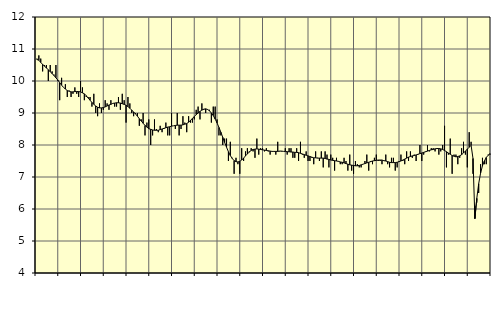
| Category | Tillverkning av verkstadsvaror, SNI 25-30, 33 | Series 1 |
|---|---|---|
| nan | 10.7 | 10.67 |
| 1.0 | 10.8 | 10.65 |
| 1.0 | 10.7 | 10.58 |
| 1.0 | 10.3 | 10.52 |
| 1.0 | 10.5 | 10.46 |
| 1.0 | 10.5 | 10.41 |
| 1.0 | 10 | 10.35 |
| 1.0 | 10.5 | 10.29 |
| 1.0 | 10.3 | 10.23 |
| 1.0 | 10.2 | 10.17 |
| 1.0 | 10.5 | 10.1 |
| 1.0 | 10 | 10.03 |
| nan | 9.4 | 9.95 |
| 2.0 | 10.1 | 9.87 |
| 2.0 | 9.8 | 9.8 |
| 2.0 | 9.9 | 9.75 |
| 2.0 | 9.5 | 9.7 |
| 2.0 | 9.7 | 9.68 |
| 2.0 | 9.5 | 9.66 |
| 2.0 | 9.6 | 9.66 |
| 2.0 | 9.8 | 9.67 |
| 2.0 | 9.6 | 9.67 |
| 2.0 | 9.5 | 9.67 |
| 2.0 | 10 | 9.66 |
| nan | 9.8 | 9.63 |
| 3.0 | 9.4 | 9.6 |
| 3.0 | 9.5 | 9.54 |
| 3.0 | 9.5 | 9.47 |
| 3.0 | 9.5 | 9.4 |
| 3.0 | 9.2 | 9.33 |
| 3.0 | 9.6 | 9.27 |
| 3.0 | 9 | 9.22 |
| 3.0 | 8.9 | 9.18 |
| 3.0 | 9.3 | 9.16 |
| 3.0 | 9 | 9.16 |
| 3.0 | 9.1 | 9.17 |
| nan | 9.4 | 9.19 |
| 4.0 | 9.3 | 9.22 |
| 4.0 | 9.1 | 9.25 |
| 4.0 | 9.4 | 9.27 |
| 4.0 | 9.3 | 9.3 |
| 4.0 | 9.2 | 9.31 |
| 4.0 | 9.2 | 9.32 |
| 4.0 | 9.5 | 9.32 |
| 4.0 | 9.1 | 9.31 |
| 4.0 | 9.6 | 9.29 |
| 4.0 | 9.4 | 9.27 |
| 4.0 | 8.7 | 9.24 |
| nan | 9.5 | 9.2 |
| 5.0 | 9.3 | 9.15 |
| 5.0 | 9 | 9.09 |
| 5.0 | 8.9 | 9.03 |
| 5.0 | 9 | 8.97 |
| 5.0 | 9 | 8.9 |
| 5.0 | 8.6 | 8.82 |
| 5.0 | 8.8 | 8.75 |
| 5.0 | 9 | 8.68 |
| 5.0 | 8.3 | 8.61 |
| 5.0 | 8.7 | 8.56 |
| 5.0 | 8.8 | 8.51 |
| nan | 8 | 8.49 |
| 6.0 | 8.3 | 8.47 |
| 6.0 | 8.8 | 8.46 |
| 6.0 | 8.5 | 8.46 |
| 6.0 | 8.4 | 8.46 |
| 6.0 | 8.6 | 8.48 |
| 6.0 | 8.4 | 8.5 |
| 6.0 | 8.5 | 8.52 |
| 6.0 | 8.7 | 8.54 |
| 6.0 | 8.3 | 8.56 |
| 6.0 | 8.3 | 8.57 |
| 6.0 | 9 | 8.59 |
| nan | 8.6 | 8.6 |
| 7.0 | 8.5 | 8.61 |
| 7.0 | 9 | 8.62 |
| 7.0 | 8.3 | 8.62 |
| 7.0 | 8.5 | 8.62 |
| 7.0 | 8.9 | 8.63 |
| 7.0 | 8.7 | 8.65 |
| 7.0 | 8.4 | 8.67 |
| 7.0 | 8.9 | 8.71 |
| 7.0 | 8.7 | 8.77 |
| 7.0 | 8.7 | 8.83 |
| 7.0 | 8.8 | 8.89 |
| nan | 9.1 | 8.95 |
| 8.0 | 9.2 | 9 |
| 8.0 | 8.8 | 9.05 |
| 8.0 | 9.3 | 9.09 |
| 8.0 | 9.1 | 9.12 |
| 8.0 | 9 | 9.13 |
| 8.0 | 9.1 | 9.11 |
| 8.0 | 9.1 | 9.07 |
| 8.0 | 8.7 | 9 |
| 8.0 | 9.2 | 8.92 |
| 8.0 | 9.2 | 8.81 |
| 8.0 | 8.8 | 8.69 |
| nan | 8.3 | 8.55 |
| 9.0 | 8.3 | 8.4 |
| 9.0 | 8 | 8.24 |
| 9.0 | 8.2 | 8.08 |
| 9.0 | 8.2 | 7.93 |
| 9.0 | 7.5 | 7.79 |
| 9.0 | 8.1 | 7.67 |
| 9.0 | 7.6 | 7.58 |
| 9.0 | 7.1 | 7.51 |
| 9.0 | 7.6 | 7.48 |
| 9.0 | 7.4 | 7.47 |
| 9.0 | 7.1 | 7.49 |
| nan | 7.9 | 7.53 |
| 10.0 | 7.5 | 7.59 |
| 10.0 | 7.8 | 7.66 |
| 10.0 | 7.9 | 7.72 |
| 10.0 | 7.8 | 7.78 |
| 10.0 | 7.9 | 7.83 |
| 10.0 | 7.8 | 7.86 |
| 10.0 | 7.6 | 7.87 |
| 10.0 | 8.2 | 7.88 |
| 10.0 | 7.7 | 7.87 |
| 10.0 | 7.9 | 7.86 |
| 10.0 | 7.9 | 7.85 |
| nan | 7.8 | 7.84 |
| 11.0 | 7.9 | 7.83 |
| 11.0 | 7.8 | 7.82 |
| 11.0 | 7.7 | 7.81 |
| 11.0 | 7.8 | 7.8 |
| 11.0 | 7.8 | 7.8 |
| 11.0 | 7.7 | 7.8 |
| 11.0 | 8.1 | 7.8 |
| 11.0 | 7.8 | 7.81 |
| 11.0 | 7.8 | 7.81 |
| 11.0 | 7.8 | 7.8 |
| 11.0 | 7.9 | 7.8 |
| nan | 7.7 | 7.79 |
| 12.0 | 7.9 | 7.79 |
| 12.0 | 7.9 | 7.78 |
| 12.0 | 7.6 | 7.78 |
| 12.0 | 7.6 | 7.77 |
| 12.0 | 7.9 | 7.77 |
| 12.0 | 7.5 | 7.76 |
| 12.0 | 8.1 | 7.74 |
| 12.0 | 7.7 | 7.72 |
| 12.0 | 7.6 | 7.7 |
| 12.0 | 7.8 | 7.68 |
| 12.0 | 7.5 | 7.66 |
| nan | 7.5 | 7.64 |
| 13.0 | 7.6 | 7.62 |
| 13.0 | 7.4 | 7.6 |
| 13.0 | 7.8 | 7.6 |
| 13.0 | 7.6 | 7.59 |
| 13.0 | 7.5 | 7.59 |
| 13.0 | 7.8 | 7.59 |
| 13.0 | 7.3 | 7.59 |
| 13.0 | 7.8 | 7.58 |
| 13.0 | 7.7 | 7.56 |
| 13.0 | 7.3 | 7.55 |
| 13.0 | 7.7 | 7.53 |
| nan | 7.6 | 7.52 |
| 14.0 | 7.2 | 7.51 |
| 14.0 | 7.6 | 7.5 |
| 14.0 | 7.5 | 7.49 |
| 14.0 | 7.4 | 7.47 |
| 14.0 | 7.4 | 7.46 |
| 14.0 | 7.6 | 7.44 |
| 14.0 | 7.5 | 7.42 |
| 14.0 | 7.2 | 7.4 |
| 14.0 | 7.7 | 7.38 |
| 14.0 | 7.2 | 7.37 |
| 14.0 | 7.1 | 7.36 |
| nan | 7.5 | 7.35 |
| 15.0 | 7.4 | 7.35 |
| 15.0 | 7.3 | 7.36 |
| 15.0 | 7.3 | 7.38 |
| 15.0 | 7.4 | 7.4 |
| 15.0 | 7.5 | 7.42 |
| 15.0 | 7.7 | 7.44 |
| 15.0 | 7.2 | 7.46 |
| 15.0 | 7.5 | 7.48 |
| 15.0 | 7.4 | 7.5 |
| 15.0 | 7.6 | 7.51 |
| 15.0 | 7.7 | 7.52 |
| nan | 7.5 | 7.53 |
| 16.0 | 7.5 | 7.53 |
| 16.0 | 7.4 | 7.53 |
| 16.0 | 7.5 | 7.51 |
| 16.0 | 7.7 | 7.5 |
| 16.0 | 7.4 | 7.48 |
| 16.0 | 7.3 | 7.46 |
| 16.0 | 7.6 | 7.45 |
| 16.0 | 7.6 | 7.45 |
| 16.0 | 7.2 | 7.45 |
| 16.0 | 7.3 | 7.46 |
| 16.0 | 7.5 | 7.48 |
| nan | 7.7 | 7.5 |
| 17.0 | 7.5 | 7.53 |
| 17.0 | 7.4 | 7.56 |
| 17.0 | 7.8 | 7.59 |
| 17.0 | 7.5 | 7.62 |
| 17.0 | 7.8 | 7.64 |
| 17.0 | 7.6 | 7.66 |
| 17.0 | 7.7 | 7.67 |
| 17.0 | 7.5 | 7.69 |
| 17.0 | 7.7 | 7.71 |
| 17.0 | 8 | 7.73 |
| 17.0 | 7.5 | 7.75 |
| nan | 7.7 | 7.77 |
| 18.0 | 7.8 | 7.79 |
| 18.0 | 8 | 7.81 |
| 18.0 | 7.8 | 7.83 |
| 18.0 | 7.9 | 7.85 |
| 18.0 | 7.9 | 7.86 |
| 18.0 | 7.8 | 7.88 |
| 18.0 | 7.9 | 7.89 |
| 18.0 | 7.7 | 7.89 |
| 18.0 | 7.8 | 7.88 |
| 18.0 | 8 | 7.86 |
| 18.0 | 8.6 | 7.83 |
| nan | 7.3 | 7.79 |
| 19.0 | 7.7 | 7.75 |
| 19.0 | 8.2 | 7.71 |
| 19.0 | 7.1 | 7.67 |
| 19.0 | 7.7 | 7.65 |
| 19.0 | 7.7 | 7.63 |
| 19.0 | 7.4 | 7.64 |
| 19.0 | 7.6 | 7.66 |
| 19.0 | 7.9 | 7.7 |
| 19.0 | 8.1 | 7.75 |
| 19.0 | 7.7 | 7.81 |
| 19.0 | 7.3 | 7.87 |
| nan | 8.4 | 7.93 |
| 20.0 | 8.1 | 7.99 |
| 20.0 | 7.1 | 7.58 |
| 20.0 | 6.1 | 5.7 |
| 20.0 | 6.2 | 6.33 |
| 20.0 | 6.5 | 6.79 |
| 20.0 | 7.4 | 7.12 |
| 20.0 | 7.6 | 7.35 |
| 20.0 | 7.4 | 7.5 |
| 20.0 | 7.4 | 7.61 |
| 20.0 | 7.7 | 7.68 |
| 20.0 | 7.7 | 7.73 |